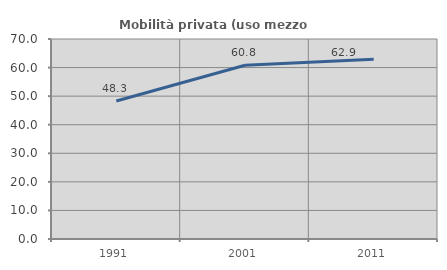
| Category | Mobilità privata (uso mezzo privato) |
|---|---|
| 1991.0 | 48.318 |
| 2001.0 | 60.821 |
| 2011.0 | 62.887 |